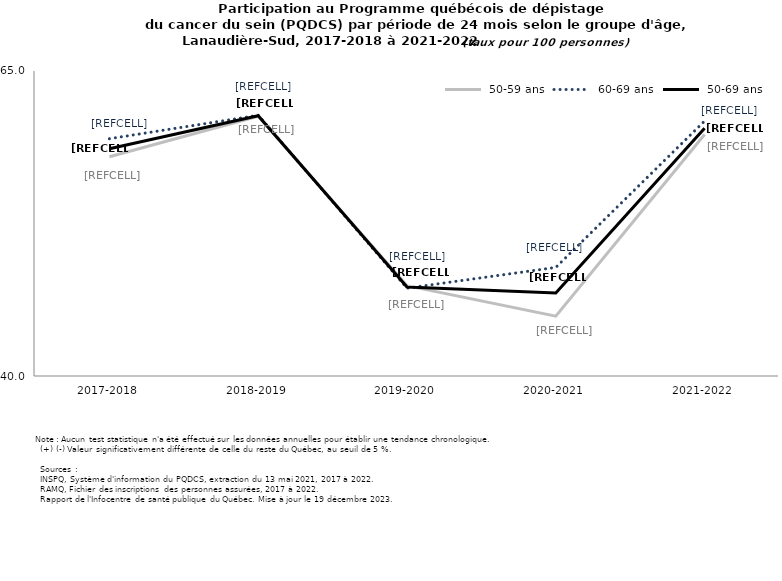
| Category |  50-59 ans |  60-69 ans |  50-69 ans |
|---|---|---|---|
| 2017-2018 | 57.975 | 59.449 | 58.632 |
| 2018-2019 | 61.296 | 61.371 | 61.33 |
| 2019-2020 | 47.4 | 47.2 | 47.3 |
| 2020-2021 | 44.9 | 48.9 | 46.8 |
| 2021-2022 | 59.8 | 60.9 | 60.3 |